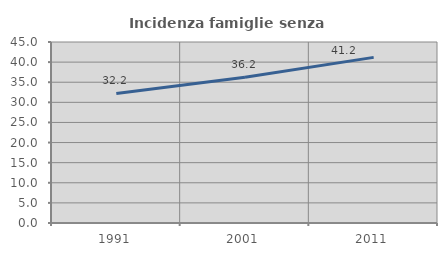
| Category | Incidenza famiglie senza nuclei |
|---|---|
| 1991.0 | 32.203 |
| 2001.0 | 36.247 |
| 2011.0 | 41.176 |